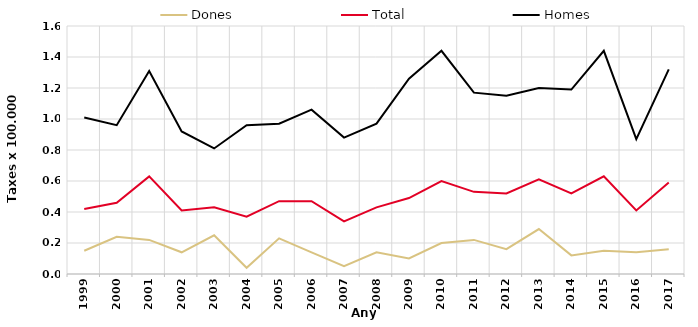
| Category | Dones | Total | Homes |
|---|---|---|---|
| 1999.0 | 0.15 | 0.42 | 1.01 |
| 2000.0 | 0.24 | 0.46 | 0.96 |
| 2001.0 | 0.22 | 0.63 | 1.31 |
| 2002.0 | 0.14 | 0.41 | 0.92 |
| 2003.0 | 0.25 | 0.43 | 0.81 |
| 2004.0 | 0.04 | 0.37 | 0.96 |
| 2005.0 | 0.23 | 0.47 | 0.97 |
| 2006.0 | 0.14 | 0.47 | 1.06 |
| 2007.0 | 0.05 | 0.34 | 0.88 |
| 2008.0 | 0.14 | 0.43 | 0.97 |
| 2009.0 | 0.1 | 0.49 | 1.26 |
| 2010.0 | 0.2 | 0.6 | 1.44 |
| 2011.0 | 0.22 | 0.53 | 1.17 |
| 2012.0 | 0.16 | 0.52 | 1.15 |
| 2013.0 | 0.29 | 0.61 | 1.2 |
| 2014.0 | 0.12 | 0.52 | 1.19 |
| 2015.0 | 0.15 | 0.63 | 1.44 |
| 2016.0 | 0.14 | 0.41 | 0.87 |
| 2017.0 | 0.16 | 0.59 | 1.32 |